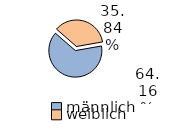
| Category | Series 0 |
|---|---|
| männlich | 64.161 |
| weiblich | 35.839 |